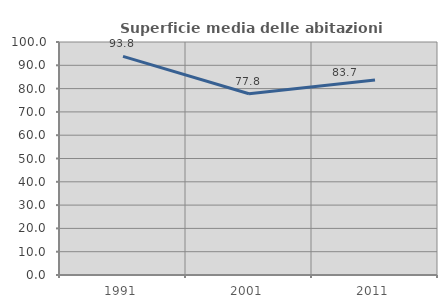
| Category | Superficie media delle abitazioni occupate |
|---|---|
| 1991.0 | 93.844 |
| 2001.0 | 77.807 |
| 2011.0 | 83.654 |